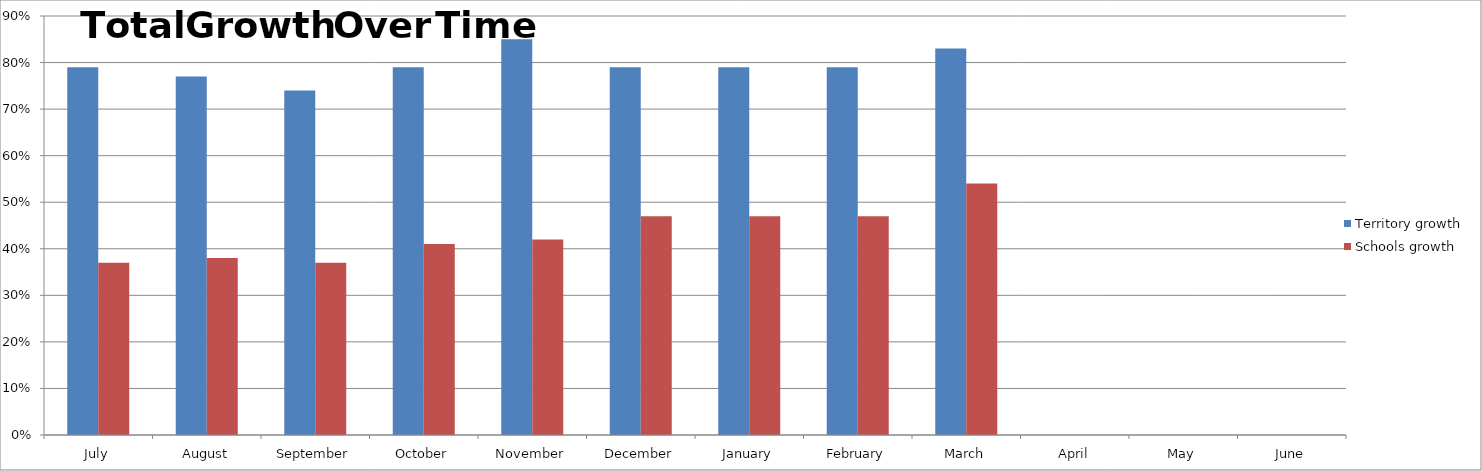
| Category | Territory growth | Schools growth |
|---|---|---|
| July | 0.79 | 0.37 |
| August | 0.77 | 0.38 |
| September | 0.74 | 0.37 |
| October | 0.79 | 0.41 |
| November | 0.85 | 0.42 |
| December | 0.79 | 0.47 |
| January | 0.79 | 0.47 |
| February | 0.79 | 0.47 |
| March | 0.83 | 0.54 |
| April | 0 | 0 |
| May | 0 | 0 |
| June | 0 | 0 |